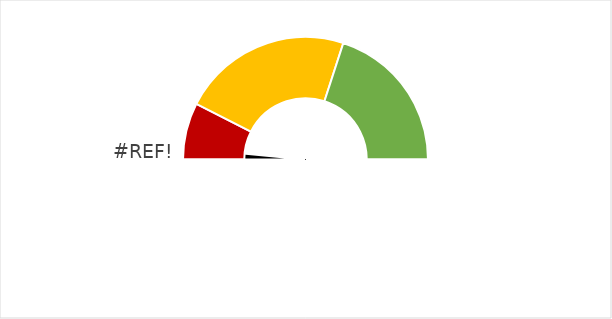
| Category | Pointer |
|---|---|
| 0 | 0 |
| 1 | 3 |
| 2 | 192 |